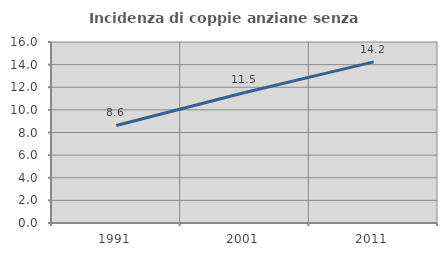
| Category | Incidenza di coppie anziane senza figli  |
|---|---|
| 1991.0 | 8.625 |
| 2001.0 | 11.536 |
| 2011.0 | 14.24 |